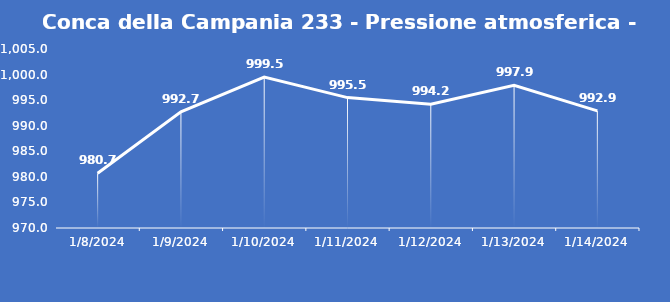
| Category | Conca della Campania 233 - Pressione atmosferica - Grezzo (hPa) |
|---|---|
| 1/8/24 | 980.7 |
| 1/9/24 | 992.7 |
| 1/10/24 | 999.5 |
| 1/11/24 | 995.5 |
| 1/12/24 | 994.2 |
| 1/13/24 | 997.9 |
| 1/14/24 | 992.9 |